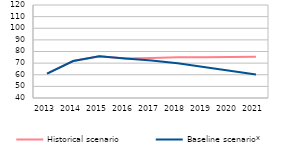
| Category | Historical scenario | Baseline scenario* |
|---|---|---|
| 2013.0 | 60.969 | 60.969 |
| 2014.0 | 71.776 | 71.776 |
| 2015.0 | 75.92 | 75.92 |
| 2016.0 | 74.049 | 74.049 |
| 2017.0 | 74.347 | 72.155 |
| 2018.0 | 75.096 | 69.899 |
| 2019.0 | 75.094 | 66.651 |
| 2020.0 | 75.343 | 63.419 |
| 2021.0 | 75.53 | 60.3 |